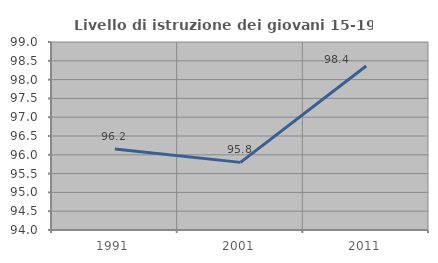
| Category | Livello di istruzione dei giovani 15-19 anni |
|---|---|
| 1991.0 | 96.154 |
| 2001.0 | 95.798 |
| 2011.0 | 98.361 |